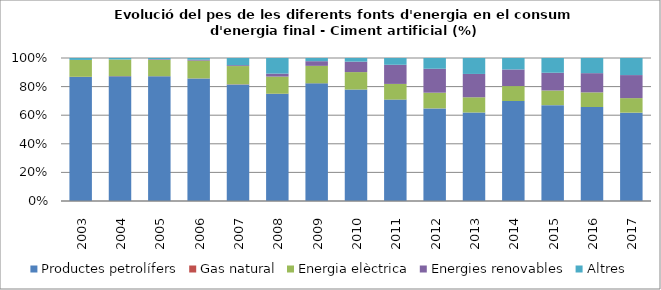
| Category | Productes petrolífers | Gas natural | Energia elèctrica | Energies renovables | Altres |
|---|---|---|---|---|---|
| 2003.0 | 641.4 | 1.1 | 87.3 | 0 | 9.9 |
| 2004.0 | 655.2 | 1.1 | 87.2 | 0.1 | 7.9 |
| 2005.0 | 666.5 | 0.4 | 87.9 | 3.1 | 6.4 |
| 2006.0 | 642.9 | 0.5 | 93.4 | 4.8 | 8.9 |
| 2007.0 | 594.6 | 1 | 92.9 | 4.5 | 36.6 |
| 2008.0 | 466.4 | 0.6 | 74.5 | 12.9 | 68 |
| 2009.0 | 394.2 | 0.2 | 58.4 | 15.6 | 10.7 |
| 2010.0 | 382.9 | 0.1 | 59.9 | 35.9 | 12.5 |
| 2011.0 | 291.5 | 0.1 | 45 | 55 | 19.5 |
| 2012.0 | 257.4 | 0.2 | 43.6 | 66.5 | 29.9 |
| 2013.0 | 161.6 | 0 | 27.8 | 42.6 | 29.1 |
| 2014.0 | 251.9 | 0 | 37.6 | 41.8 | 28.9 |
| 2015.0 | 234.7 | 0 | 35.9 | 43.4 | 36.1 |
| 2016.0 | 252.5 | 0 | 39.3 | 51.6 | 40.7 |
| 2017.0 | 255.4 | 0 | 42.1 | 66.6 | 49.4 |